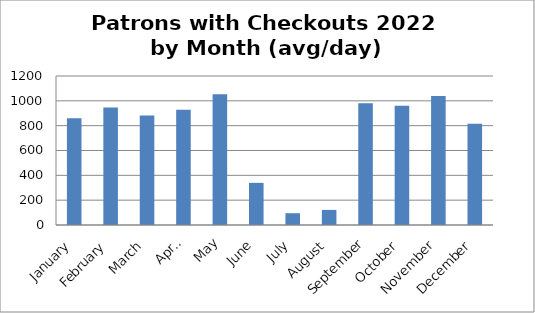
| Category | 860 |
|---|---|
| January | 860 |
| February | 946.893 |
| March | 881.677 |
| April | 927.267 |
| May | 1052.161 |
| June | 339.433 |
| July | 94.871 |
| August | 121.484 |
| September | 979.9 |
| October | 960.742 |
| November | 1039.1 |
| December | 814.839 |